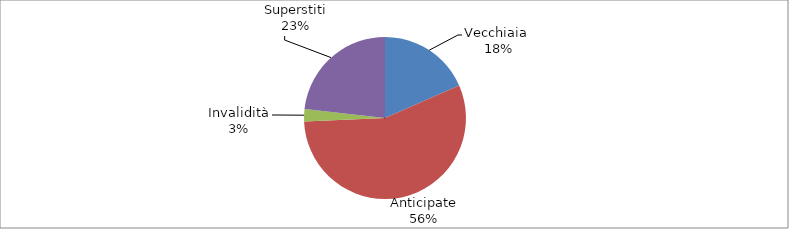
| Category | Series 0 |
|---|---|
| Vecchiaia  | 31024 |
| Anticipate | 94257 |
| Invalidità | 4158 |
| Superstiti | 39133 |